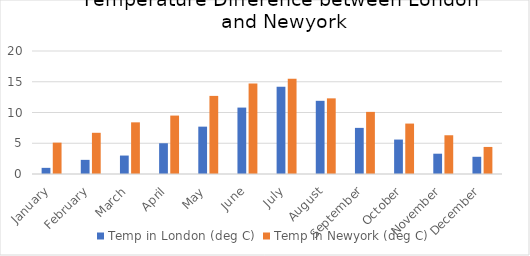
| Category | Temp in London (deg C) | Temp in Newyork (deg C) |
|---|---|---|
| January | 1 | 5.1 |
| February | 2.3 | 6.7 |
| March | 3 | 8.4 |
| April | 5 | 9.5 |
| May | 7.7 | 12.7 |
| June | 10.8 | 14.7 |
| July | 14.2 | 15.5 |
| August | 11.9 | 12.3 |
| September | 7.5 | 10.1 |
| October | 5.6 | 8.2 |
| November | 3.3 | 6.3 |
| December | 2.8 | 4.4 |